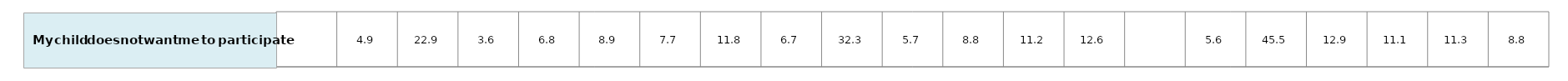
| Category | #REF! |
|---|---|
| nan | 1 |
| 4.8734299961363305 | 1 |
| 22.90844931402976 | 1 |
| 3.5934162354005 | 1 |
| 6.80943554814637 | 1 |
| 8.91520044355904 | 1 |
| 7.73213698914146 | 1 |
| 11.76409544987923 | 1 |
| 6.65053455631295 | 1 |
| 32.33660904689161 | 1 |
| 5.6552565015157 | 1 |
| 8.784530248942959 | 1 |
| 11.17794980287919 | 1 |
| 12.575553558172421 | 1 |
| nan | 1 |
| 5.5562024480811 | 1 |
| 45.51833652839418 | 1 |
| 12.897547276414862 | 1 |
| 11.12037459091069 | 1 |
| 11.255471690514959 | 1 |
| 8.810987379952701 | 1 |